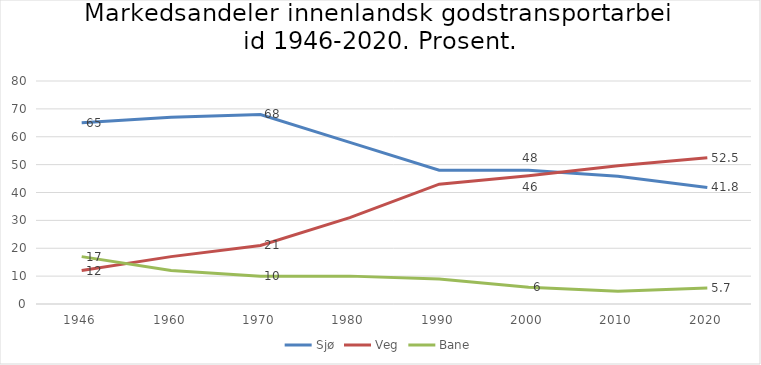
| Category | Tabell: Markedsandeler i innenlandsk godstransportarbeid 1946-2019. Prosent. |
|---|---|
| 1946.0 | 17 |
| 1960.0 | 12 |
| 1970.0 | 10 |
| 1980.0 | 10 |
| 1990.0 | 9 |
| 2000.0 | 6 |
| 2010.0 | 4.6 |
| 2020.0 | 5.7 |